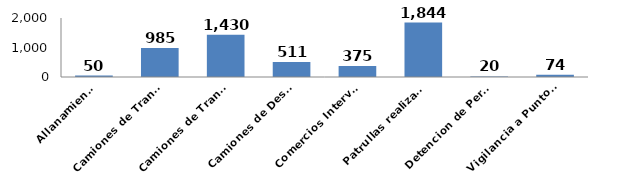
| Category | Series 0 |
|---|---|
| Allanamientos | 50 |
| Camiones de Transporte de Combustibles | 985 |
| Camiones de Transporte de Mercancias | 1430 |
| Camiones de Desechos Oleosos | 511 |
| Comercios Intervenidos | 375 |
| Patrullas realizadas | 1844 |
| Detencion de Personas | 20 |
| Vigilancia a Puntos de Interes | 74 |